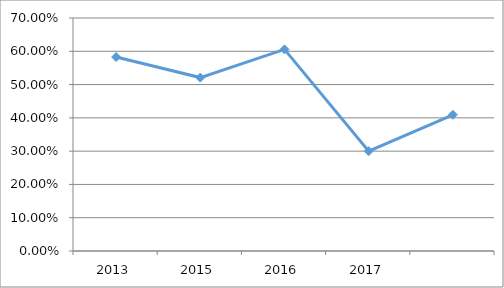
| Category | TEMA-M5O12 |
|---|---|
| 2013.0 | 0.583 |
| 2015.0 | 0.521 |
| 2016.0 | 0.606 |
| 2017.0 | 0.3 |